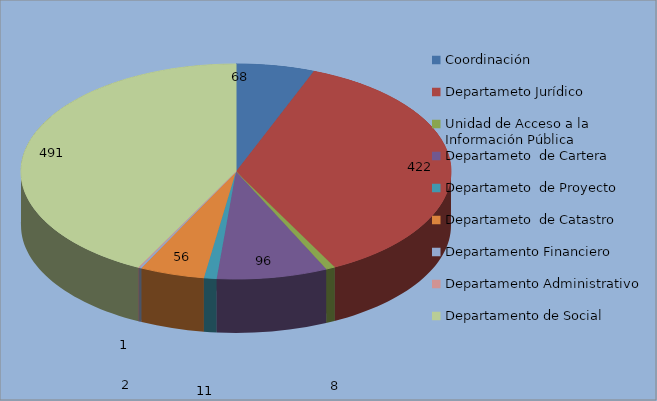
| Category | Series 0 |
|---|---|
| Coordinación | 68 |
| Departameto Jurídico  | 422 |
| Unidad de Acceso a la Información Pública | 8 |
| Departameto  de Cartera | 96 |
| Departameto  de Proyecto | 11 |
| Departameto  de Catastro | 56 |
| Departamento Financiero  | 2 |
| Departamento Administrativo | 1 |
| Departamento de Social | 491 |